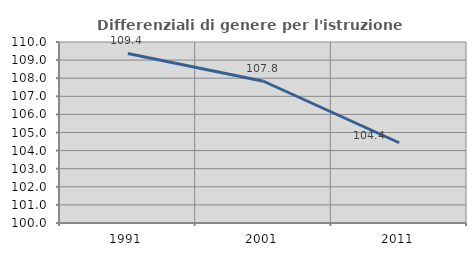
| Category | Differenziali di genere per l'istruzione superiore |
|---|---|
| 1991.0 | 109.367 |
| 2001.0 | 107.832 |
| 2011.0 | 104.434 |